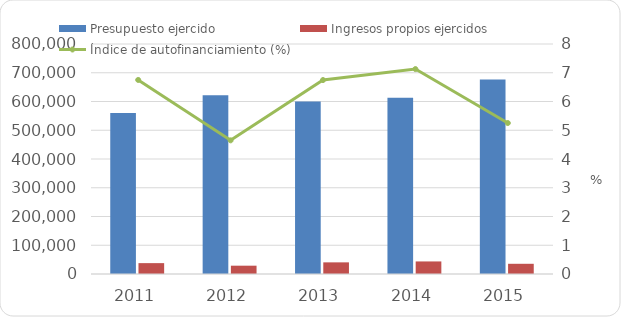
| Category | Presupuesto ejercido | Ingresos propios ejercidos  |
|---|---|---|
| 2011 | 560225 | 37815 |
| 2012 | 621909.5 | 28915 |
| 2013 | 600163.1 | 40487.2 |
| 2014 | 613052.1 | 43697.9 |
| 2015 | 676403.338 | 35517.936 |